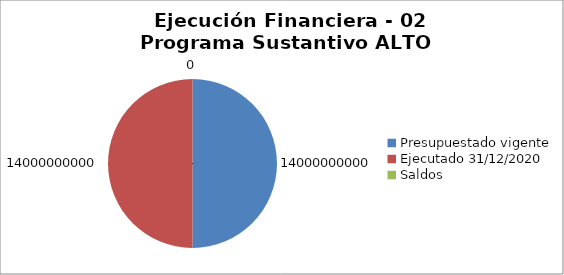
| Category | 4.8 Ejecución Financiera (Generar gráfica) 0 0 | 14000000000 14000000000 0 |
|---|---|---|
| Presupuestado vigente | 14000000000 | 800 |
| Ejecutado 31/12/2020 | 14000000000 | 831 |
| Saldos | 0 | 0 |